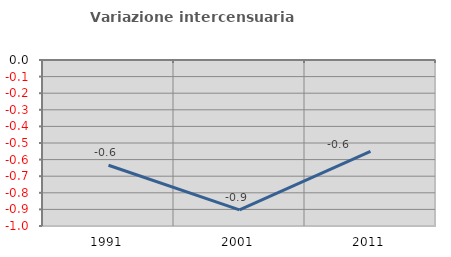
| Category | Variazione intercensuaria annua |
|---|---|
| 1991.0 | -0.634 |
| 2001.0 | -0.903 |
| 2011.0 | -0.551 |